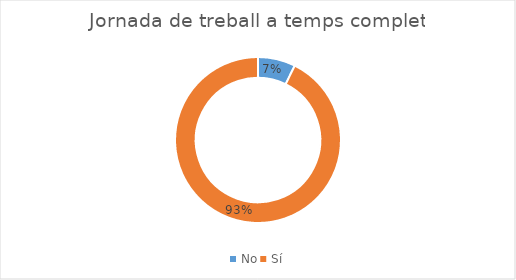
| Category | Series 0 |
|---|---|
| No | 6 |
| Sí | 76 |